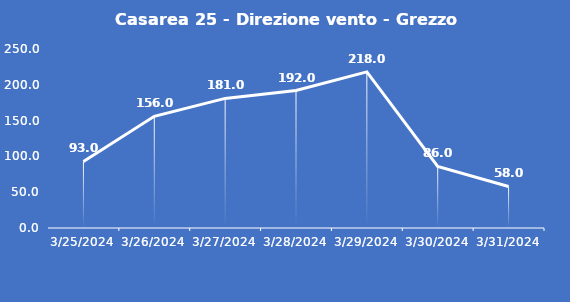
| Category | Casarea 25 - Direzione vento - Grezzo (°N) |
|---|---|
| 3/25/24 | 93 |
| 3/26/24 | 156 |
| 3/27/24 | 181 |
| 3/28/24 | 192 |
| 3/29/24 | 218 |
| 3/30/24 | 86 |
| 3/31/24 | 58 |